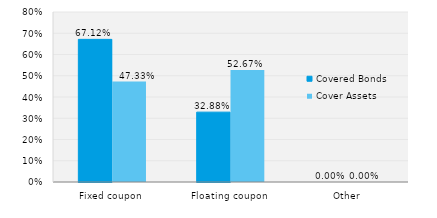
| Category | Covered Bonds | Cover Assets |
|---|---|---|
| Fixed coupon | 0.671 | 0.473 |
| Floating coupon | 0.329 | 0.527 |
| Other | 0 | 0 |